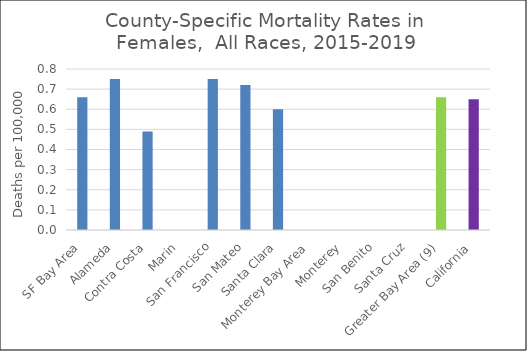
| Category | Female |
|---|---|
| SF Bay Area | 0.66 |
|   Alameda | 0.75 |
|   Contra Costa | 0.49 |
|   Marin | 0 |
|   San Francisco | 0.75 |
|   San Mateo | 0.72 |
|   Santa Clara | 0.6 |
| Monterey Bay Area | 0 |
|   Monterey | 0 |
|   San Benito | 0 |
|   Santa Cruz | 0 |
| Greater Bay Area (9) | 0.66 |
| California | 0.65 |